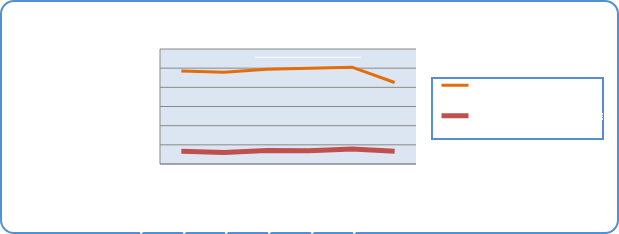
| Category | Motorin Türleri | Benzin Türleri |
|---|---|---|
| 1/13/20 | 48525779.716 | 6714583.402 |
| 1/14/20 | 47867614.767 | 5971516.266 |
| 1/15/20 | 49481295.458 | 6989461.656 |
| 1/16/20 | 49959917.006 | 6919548.867 |
| 1/17/20 | 50509651.243 | 7825330.56 |
| 1/18/20 | 42526937.365 | 6628870.601 |